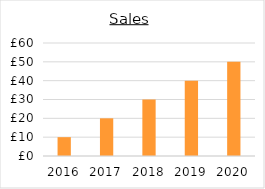
| Category | Series 0 |
|---|---|
| 2016.0 | 10 |
| 2017.0 | 20 |
| 2018.0 | 30 |
| 2019.0 | 40 |
| 2020.0 | 50 |